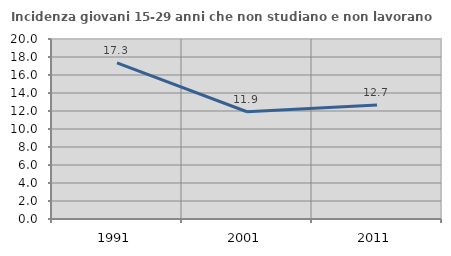
| Category | Incidenza giovani 15-29 anni che non studiano e non lavorano  |
|---|---|
| 1991.0 | 17.341 |
| 2001.0 | 11.915 |
| 2011.0 | 12.67 |